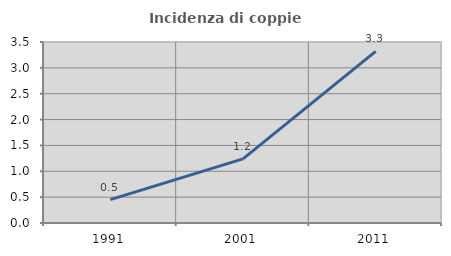
| Category | Incidenza di coppie miste |
|---|---|
| 1991.0 | 0.452 |
| 2001.0 | 1.241 |
| 2011.0 | 3.32 |